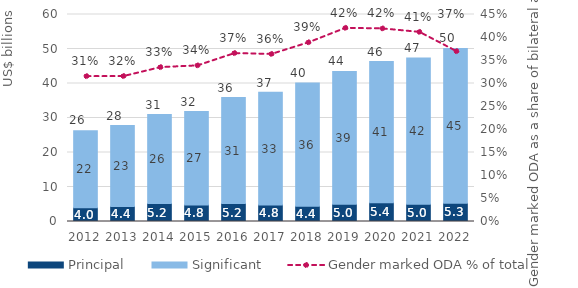
| Category | Principal | Significant |
|---|---|---|
| 2012.0 | 3961.155 | 22350.45 |
| 2013.0 | 4369.821 | 23423.468 |
| 2014.0 | 5201.916 | 25814.546 |
| 2015.0 | 4778.274 | 27114.184 |
| 2016.0 | 5184.499 | 30745.502 |
| 2017.0 | 4815.764 | 32682.507 |
| 2018.0 | 4422.246 | 35756.265 |
| 2019.0 | 4968.261 | 38542.852 |
| 2020.0 | 5411.174 | 40990.085 |
| 2021.0 | 4993.361 | 42417.541 |
| 2022.0 | 5265.241 | 44903.134 |